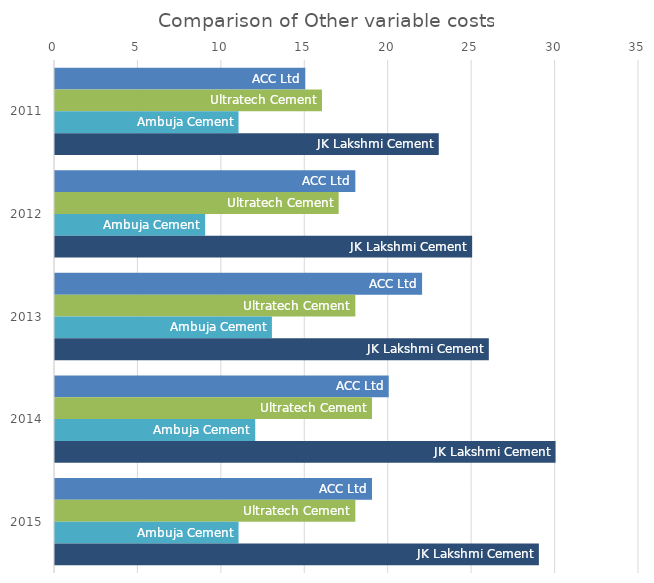
| Category | ACC Ltd | Ultratech Cement | Ambuja Cement | JK Lakshmi Cement |
|---|---|---|---|---|
| 2011 | 15 | 16 | 11 | 23 |
| 2012 | 18 | 17 | 9 | 25 |
| 2013 | 22 | 18 | 13 | 26 |
| 2014 | 20 | 19 | 12 | 30 |
| 2015 | 19 | 18 | 11 | 29 |